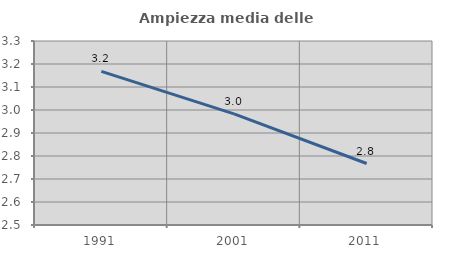
| Category | Ampiezza media delle famiglie |
|---|---|
| 1991.0 | 3.168 |
| 2001.0 | 2.983 |
| 2011.0 | 2.767 |